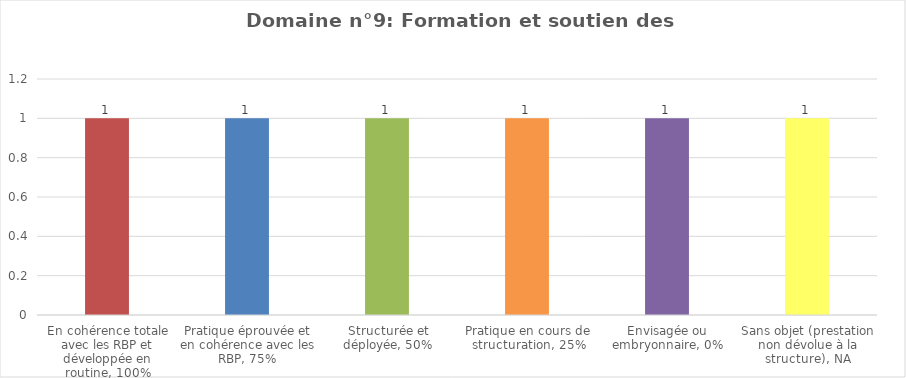
| Category | Domaine n°9: Formation et soutien des professionnels |
|---|---|
| En cohérence totale avec les RBP et développée en routine, 100% | 1 |
| Pratique éprouvée et en cohérence avec les RBP, 75% | 1 |
| Structurée et déployée, 50% | 1 |
| Pratique en cours de structuration, 25% | 1 |
| Envisagée ou embryonnaire, 0% | 1 |
| Sans objet (prestation non dévolue à la structure), NA | 1 |